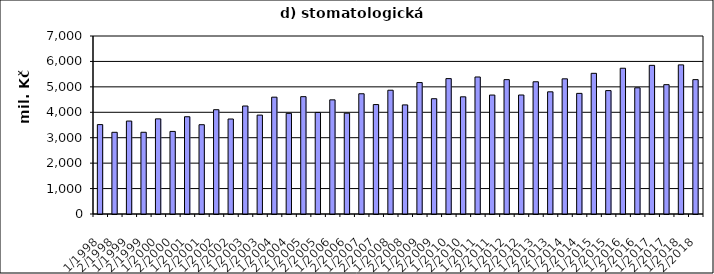
| Category | Series 0 |
|---|---|
| 1/1998 | 3515432.421 |
| 2/1998 | 3212433.829 |
| 1/1999 | 3655162.521 |
| 2/1999 | 3214272.479 |
| 1/2000 | 3741126.891 |
| 2/2000 | 3247495.509 |
| 1/2001 | 3824635.222 |
| 2/2001 | 3511526.704 |
| 1/2002 | 4101374 |
| 2/2002 | 3735503 |
| 1/2003 | 4246929 |
| 2/2003 | 3889102.248 |
| 1/2004 | 4594398.653 |
| 2/2004 | 3958067.471 |
| 1/2005 | 4614097 |
| 2/2005 | 3993003.251 |
| 1/2006 | 4488901 |
| 2/2006 | 3965590 |
| 1/2007 | 4728410 |
| 2/2007 | 4303714 |
| 1/2008 | 4867338.45 |
| 2/2008 | 4289919.55 |
| 1/2009 | 5168332 |
| 2/2009 | 4533427 |
| 1/2010 | 5323775 |
| 2/2010 | 4608300 |
| 1/2011 | 5387942 |
| 2/2011 | 4677891 |
| 1/2012 | 5284305 |
| 2/2012 | 4679314 |
| 1/2013 | 5199899 |
| 2/2013 | 4805072 |
| 1/2014 | 5315320 |
| 2/2014 | 4743466 |
| 1/2015 | 5532126 |
| 2/2015 | 4853018 |
| 1/2016 | 5732094 |
| 2/2016 | 4963624 |
| 1/2017 | 5846000 |
| 2/2017 | 5085949 |
| 1/2018 | 5864440.949 |
| 2/2018 | 5284342.393 |